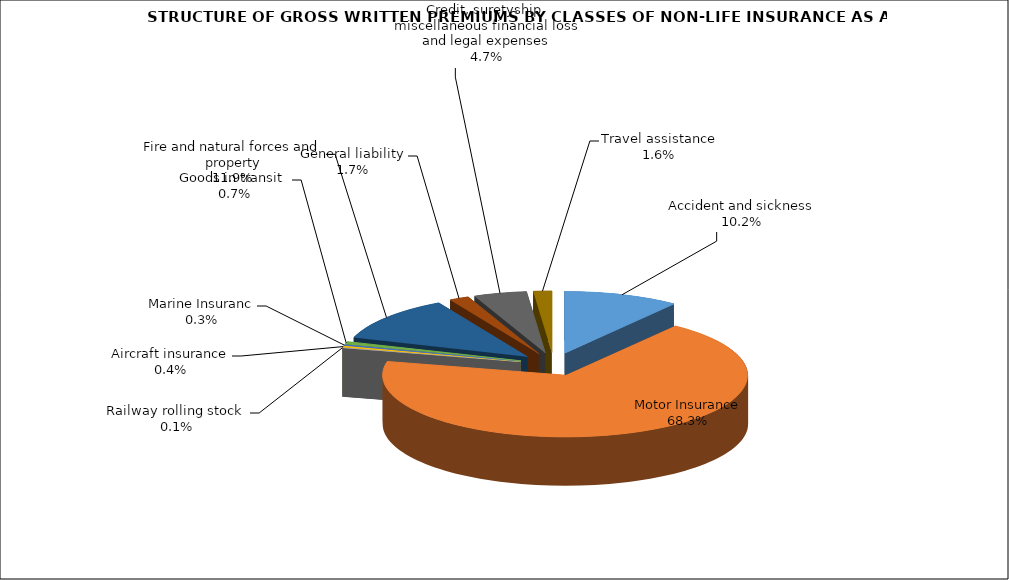
| Category | Accident and sickness | Series 1 |
|---|---|---|
| Accident and sickness | 0.102 | 0.12 |
| Motor Insurance | 0.683 | 0.652 |
| Railway rolling stock  | 0.001 | 0.001 |
| Aircraft insurance | 0.004 | 0.003 |
| Marine Insuranc | 0.003 | 0.002 |
| Goods in transit  | 0.007 | 0.007 |
| Fire and natural forces and property | 0.119 | 0.147 |
| General liability | 0.017 | 0.021 |
| Credit, suretyship, miscellaneous financial loss and legal expenses | 0.047 | 0.038 |
| Travel assistance | 0.016 | 0.008 |